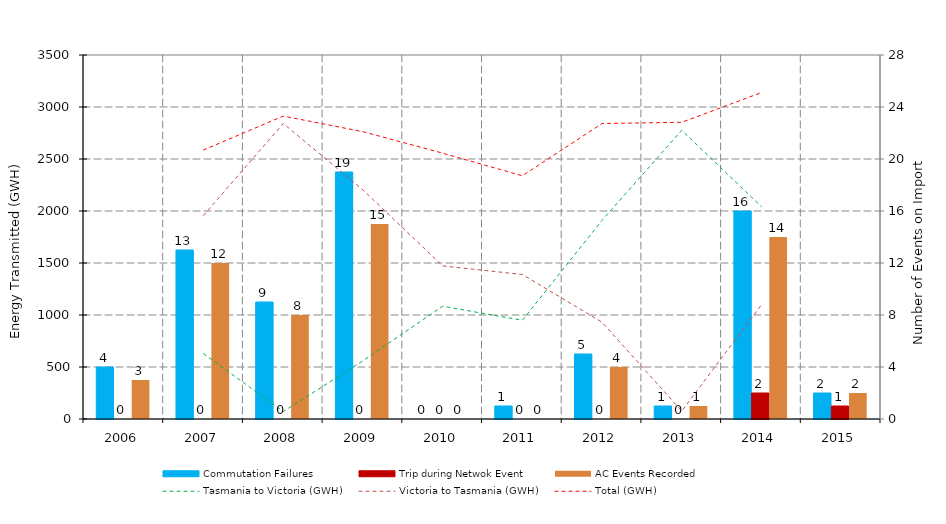
| Category | Commutation Failures | Trip during Netwok Event | AC Events Recorded |
|---|---|---|---|
| 2006.0 | 4 | 0 | 3 |
| 2007.0 | 13 | 0 | 12 |
| 2008.0 | 9 | 0 | 8 |
| 2009.0 | 19 | 0 | 15 |
| 2010.0 | 0 | 0 | 0 |
| 2011.0 | 1 | 0 | 0 |
| 2012.0 | 5 | 0 | 4 |
| 2013.0 | 1 | 0 | 1 |
| 2014.0 | 16 | 2 | 14 |
| 2015.0 | 2 | 1 | 2 |